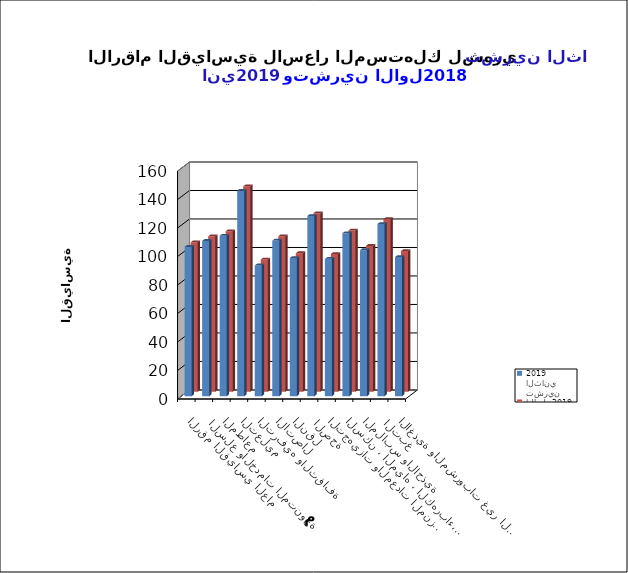
| Category | تشرين الثاني  2019      | تشرين الاول  2019      |
|---|---|---|
| الاغذية والمشروبات غير الكحولية | 97.7 | 98.7 |
|  التبغ | 120.9 | 121.1 |
| الملابس والاحذية | 102.5 | 102.3 |
| السكن ، المياه ، الكهرباء، الغاز  | 114.4 | 113.1 |
| التجهيزات والمعدات المنزلية والصيانة | 96.4 | 96.6 |
|  الصحة | 126.5 | 125.2 |
| النقل | 97 | 97.2 |
| الاتصال | 109.2 | 109.1 |
| الترفيه والثقافة | 91.8 | 92.8 |
| التعليم | 144.2 | 144.1 |
| المطاعم  | 112.6 | 112.6 |
|  السلع والخدمات المتنوعة | 109 | 109 |
| الرقم القياسي العام | 104.8 | 104.8 |